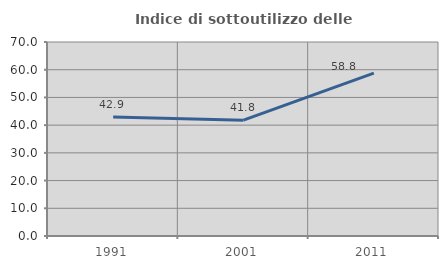
| Category | Indice di sottoutilizzo delle abitazioni  |
|---|---|
| 1991.0 | 42.935 |
| 2001.0 | 41.808 |
| 2011.0 | 58.788 |